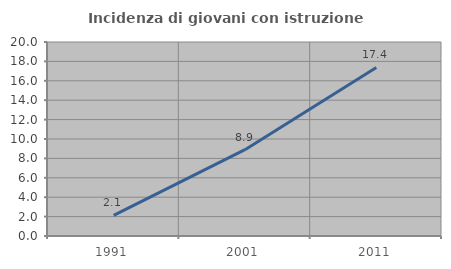
| Category | Incidenza di giovani con istruzione universitaria |
|---|---|
| 1991.0 | 2.13 |
| 2001.0 | 8.901 |
| 2011.0 | 17.376 |